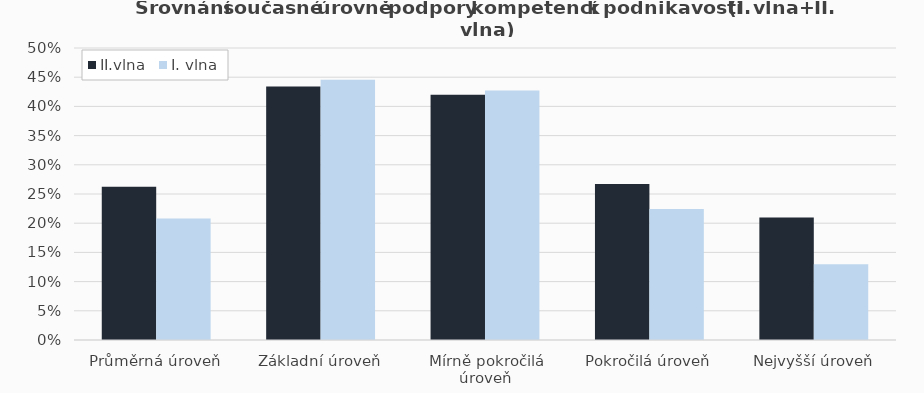
| Category | II.vlna | I. vlna |
|---|---|---|
| Průměrná úroveň | 0.263 | 0.208 |
| Základní úroveň | 0.434 | 0.445 |
| Mírně pokročilá úroveň | 0.42 | 0.427 |
| Pokročilá úroveň | 0.267 | 0.224 |
| Nejvyšší úroveň | 0.21 | 0.13 |